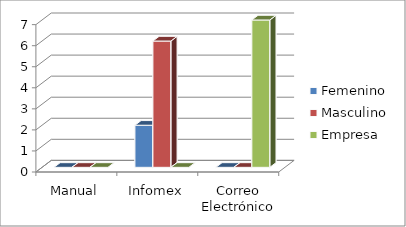
| Category | Femenino | Masculino | Empresa |
|---|---|---|---|
| 0 | 0 | 0 | 0 |
| 1 | 2 | 6 | 0 |
| 2 | 0 | 0 | 7 |